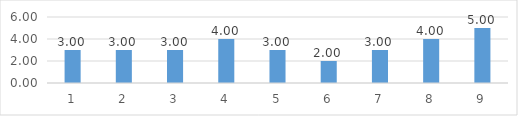
| Category | Series 0 |
|---|---|
| 0 | 3 |
| 1 | 3 |
| 2 | 3 |
| 3 | 4 |
| 4 | 3 |
| 5 | 2 |
| 6 | 3 |
| 7 | 4 |
| 8 | 5 |